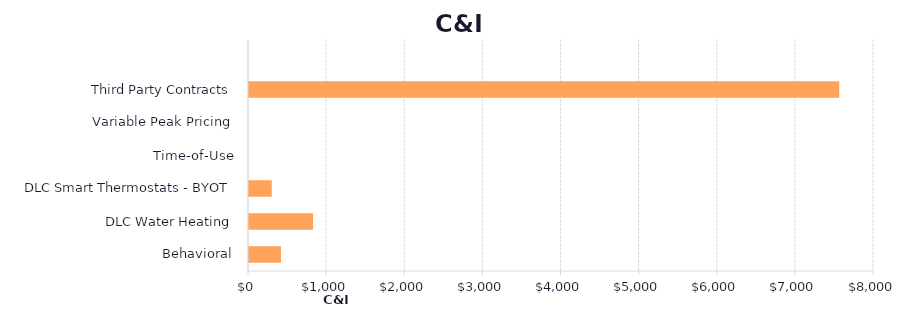
| Category | Series 1 |
|---|---|
| Behavioral | 409.315 |
| DLC Water Heating | 819.849 |
| DLC Smart Thermostats - BYOT | 291.72 |
| Time-of-Use | 0 |
| Variable Peak Pricing | 0 |
| Third Party Contracts | 7555.283 |